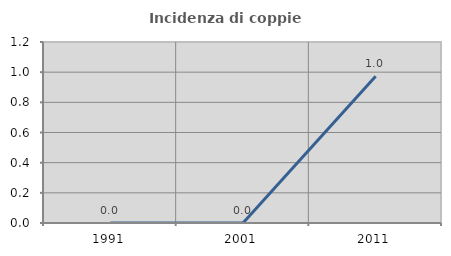
| Category | Incidenza di coppie miste |
|---|---|
| 1991.0 | 0 |
| 2001.0 | 0 |
| 2011.0 | 0.973 |